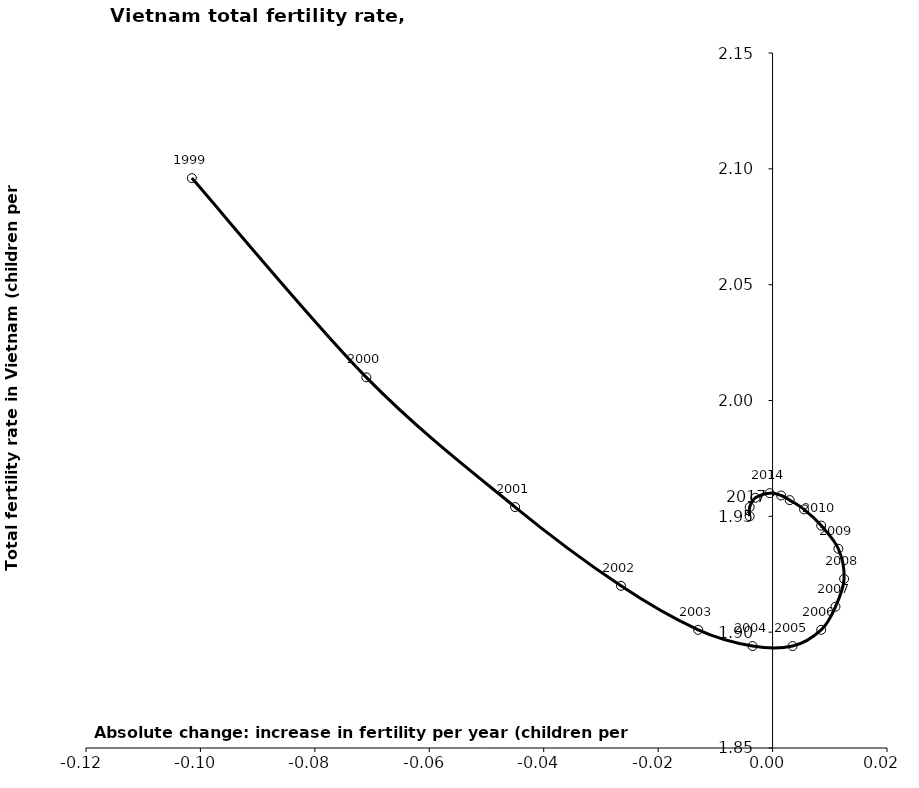
| Category | Series 0 |
|---|---|
| -0.10150000000000015 | 2.096 |
| -0.07100000000000006 | 2.01 |
| -0.04499999999999993 | 1.954 |
| -0.026499999999999968 | 1.92 |
| -0.013000000000000012 | 1.901 |
| -0.0035000000000000586 | 1.894 |
| 0.0035000000000000586 | 1.894 |
| 0.008500000000000063 | 1.901 |
| 0.01100000000000001 | 1.911 |
| 0.012499999999999956 | 1.923 |
| 0.011499999999999955 | 1.936 |
| 0.008500000000000063 | 1.946 |
| 0.00550000000000006 | 1.953 |
| 0.0030000000000000027 | 1.957 |
| 0.0014999999999999458 | 1.959 |
| -0.000500000000000056 | 1.96 |
| -0.0030000000000000027 | 1.958 |
| -0.0040000000000000036 | 1.954 |
| -0.0040000000000000036 | 1.95 |